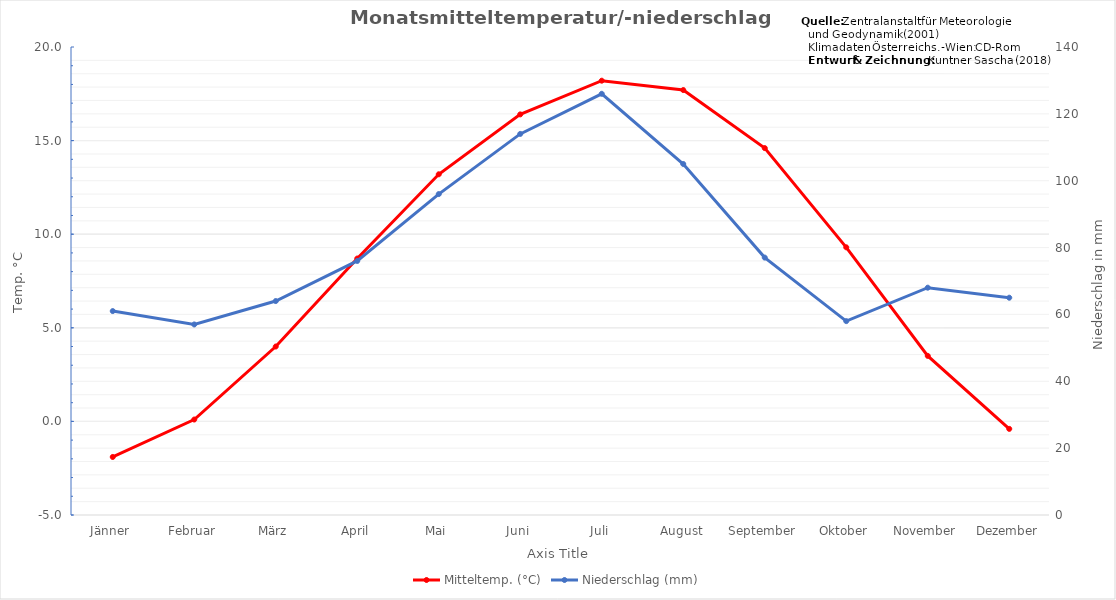
| Category | Mitteltemp. (°C) |
|---|---|
| Jänner | -1.9 |
| Februar | 0.1 |
| März | 4 |
| April | 8.7 |
| Mai | 13.2 |
| Juni | 16.4 |
| Juli | 18.2 |
| August | 17.7 |
| September | 14.6 |
| Oktober | 9.3 |
| November | 3.5 |
| Dezember | -0.4 |